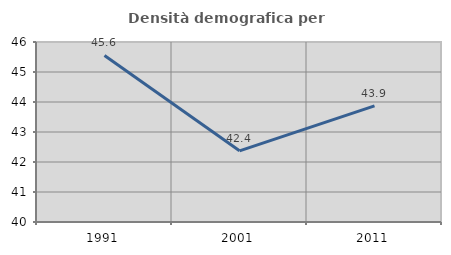
| Category | Densità demografica |
|---|---|
| 1991.0 | 45.55 |
| 2001.0 | 42.372 |
| 2011.0 | 43.873 |